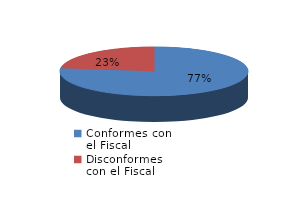
| Category | Series 0 |
|---|---|
| 0 | 47 |
| 1 | 14 |